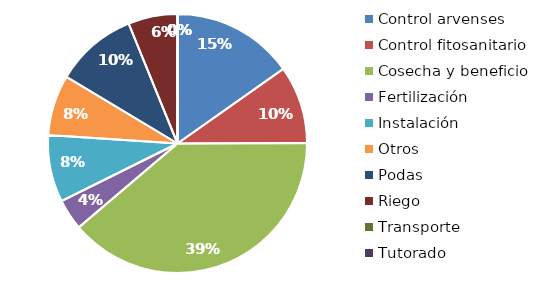
| Category | Valor |
|---|---|
| Control arvenses | 4512000 |
| Control fitosanitario | 2880000 |
| Cosecha y beneficio | 11520000 |
| Fertilización | 1152000 |
| Instalación | 2481000 |
| Otros | 2240000 |
| Podas | 3040000 |
| Riego | 1824000 |
| Transporte | 0 |
| Tutorado | 0 |